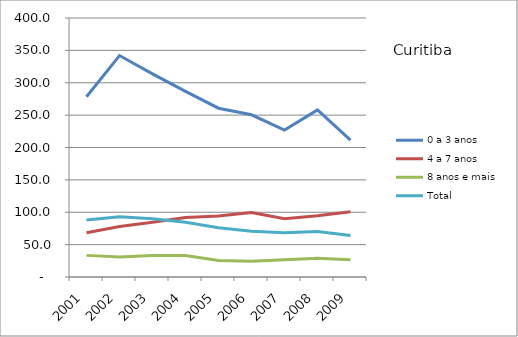
| Category | 0 a 3 anos | 4 a 7 anos | 8 anos e mais | Total |
|---|---|---|---|---|
| 2001.0 | 278.3 | 68.3 | 33.4 | 88.1 |
| 2002.0 | 342 | 78 | 30.8 | 93 |
| 2003.0 | 313.8 | 84.5 | 33.2 | 89.8 |
| 2004.0 | 286.7 | 92 | 33.1 | 84.7 |
| 2005.0 | 260.7 | 94.2 | 25.4 | 76 |
| 2006.0 | 250.5 | 99.7 | 24.4 | 70.5 |
| 2007.0 | 227 | 90 | 26.7 | 68.5 |
| 2008.0 | 258.1 | 94.6 | 29 | 70.4 |
| 2009.0 | 211.4 | 100.6 | 26.8 | 64 |